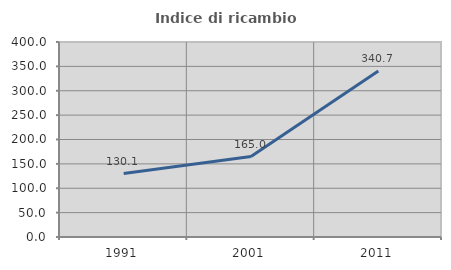
| Category | Indice di ricambio occupazionale  |
|---|---|
| 1991.0 | 130.058 |
| 2001.0 | 165.035 |
| 2011.0 | 340.659 |